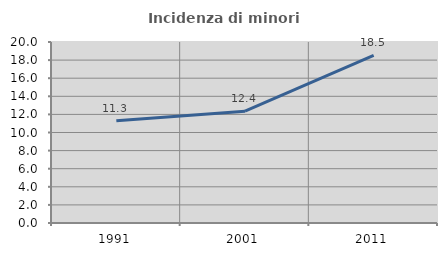
| Category | Incidenza di minori stranieri |
|---|---|
| 1991.0 | 11.29 |
| 2001.0 | 12.353 |
| 2011.0 | 18.526 |